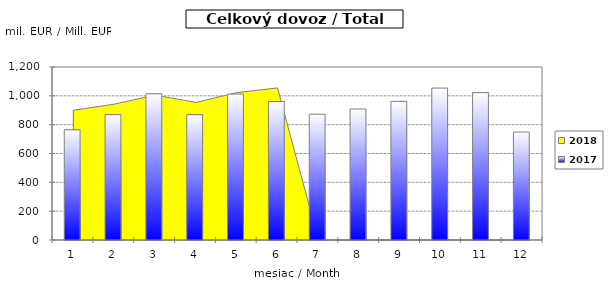
| Category | 2017 |
|---|---|
| 0 | 764.327 |
| 1 | 869.622 |
| 2 | 1014.127 |
| 3 | 869.096 |
| 4 | 1012.171 |
| 5 | 960.16 |
| 6 | 872.653 |
| 7 | 908.738 |
| 8 | 961.783 |
| 9 | 1053.901 |
| 10 | 1021.722 |
| 11 | 748.849 |